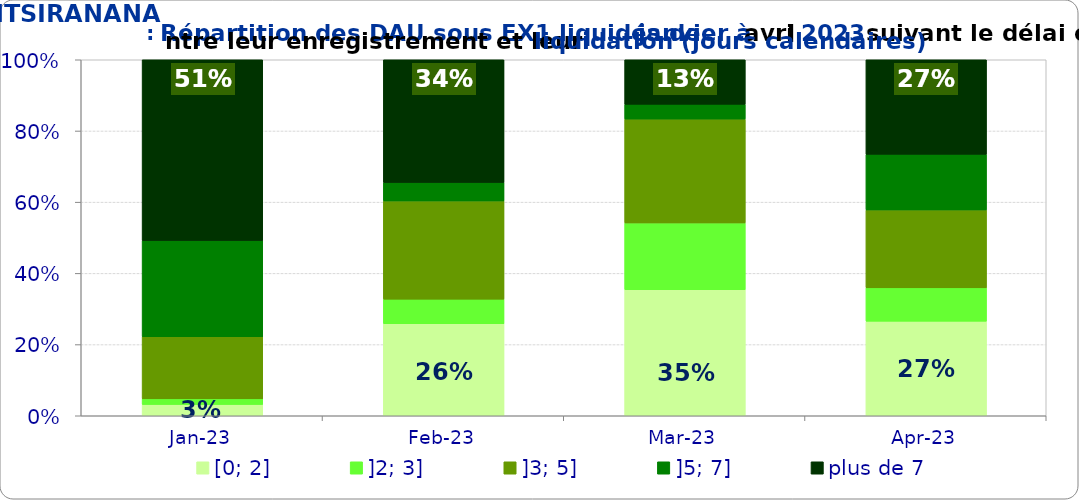
| Category | [0; 2] | ]2; 3] | ]3; 5] | ]5; 7] | plus de 7 |
|---|---|---|---|---|---|
| 2023-01-01 | 0.032 | 0.016 | 0.175 | 0.27 | 0.508 |
| 2023-02-01 | 0.259 | 0.069 | 0.276 | 0.052 | 0.345 |
| 2023-03-01 | 0.354 | 0.188 | 0.292 | 0.042 | 0.125 |
| 2023-04-01 | 0.266 | 0.094 | 0.219 | 0.156 | 0.266 |